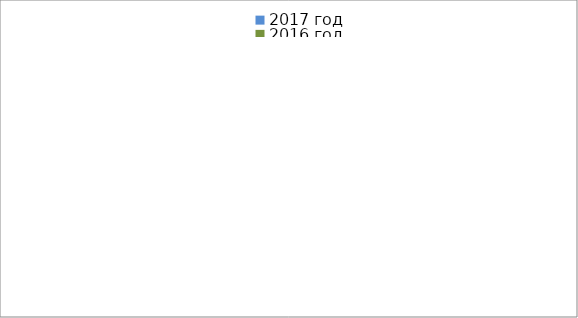
| Category | 2017 год | 2016 год |
|---|---|---|
|  - поджог | 15 | 39 |
|  - неосторожное обращение с огнём | 7 | 22 |
|  - НПТЭ электрооборудования | 22 | 19 |
|  - НПУ и Э печей | 46 | 32 |
|  - НПУ и Э транспортных средств | 45 | 31 |
|   -Шалость с огнем детей | 4 | 6 |
|  -НППБ при эксплуатации эл.приборов | 24 | 14 |
|  - курение | 35 | 22 |
| - прочие | 73 | 91 |
| - не установленные причины | 0 | 12 |